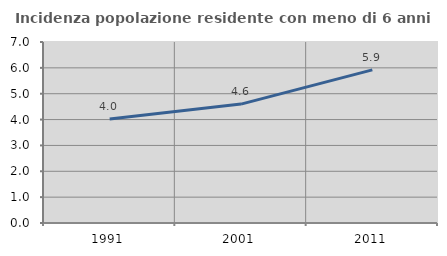
| Category | Incidenza popolazione residente con meno di 6 anni |
|---|---|
| 1991.0 | 4.022 |
| 2001.0 | 4.598 |
| 2011.0 | 5.924 |